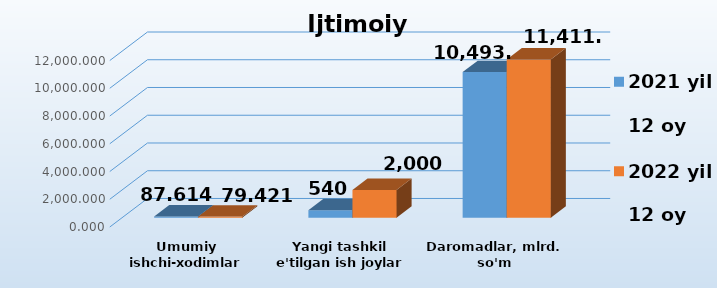
| Category | 2021 yil    
12 oy | 2022 yil    
12 oy |
|---|---|---|
| Umumiy ishchi-xodimlar soni, ming odam | 87.614 | 79.421 |
| Yangi tashkil e'tilgan ish joylar | 540 | 2000 |
| Daromadlar, mlrd. so'm | 10493.3 | 11411.3 |